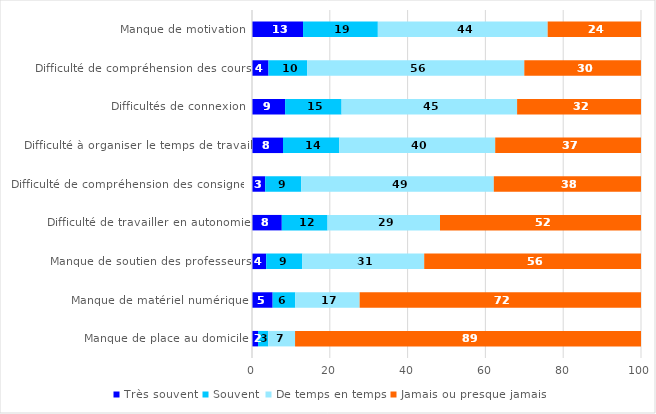
| Category | Très souvent | Souvent | De temps en temps | Jamais ou presque jamais |
|---|---|---|---|---|
| Manque de motivation | 13.12 | 19.23 | 43.66 | 23.99 |
| Difficulté de compréhension des cours | 4.24 | 9.93 | 55.83 | 29.99 |
| Difficultés de connexion | 8.51 | 14.52 | 45.12 | 31.85 |
| Difficulté à organiser le temps de travail | 7.97 | 14.48 | 40.07 | 37.48 |
| Difficulté de compréhension des consignes | 3.39 | 9.28 | 49.49 | 37.84 |
| Difficulté de travailler en autonomie | 7.66 | 11.76 | 28.91 | 51.67 |
| Manque de soutien des professeurs | 3.64 | 9.3 | 31.33 | 55.73 |
| Manque de matériel numérique | 5.31 | 5.81 | 16.55 | 72.33 |
| Manque de place au domicile | 1.56 | 2.61 | 6.9 | 88.93 |